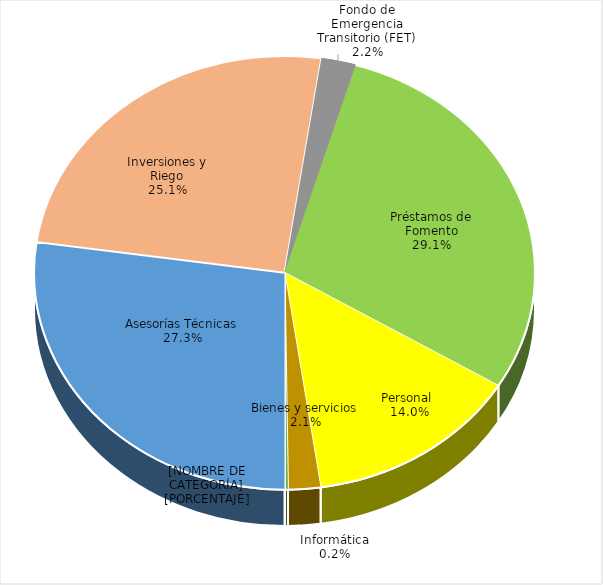
| Category | Series 0 |
|---|---|
| Asesorías Técnicas | 84078104 |
| Inversiones y Riego | 77360277 |
| Fondo de Emergencia Transitorio (FET) | 6900975 |
| Préstamos de Fomento | 89861262 |
| Personal  | 43098921 |
| Bienes y servicios | 6408868 |
| Informática | 601270 |
| Vehículos | 74131 |
| Otros | 30 |